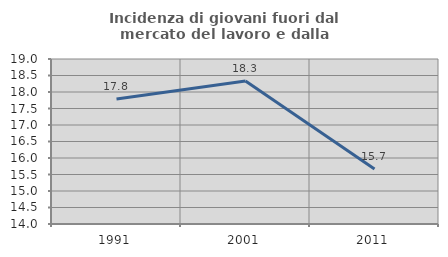
| Category | Incidenza di giovani fuori dal mercato del lavoro e dalla formazione  |
|---|---|
| 1991.0 | 17.789 |
| 2001.0 | 18.333 |
| 2011.0 | 15.666 |